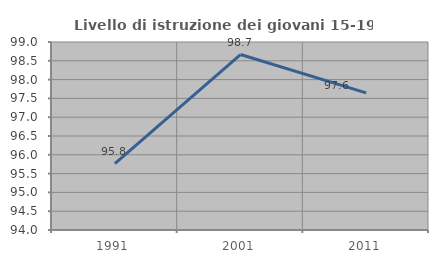
| Category | Livello di istruzione dei giovani 15-19 anni |
|---|---|
| 1991.0 | 95.763 |
| 2001.0 | 98.667 |
| 2011.0 | 97.647 |